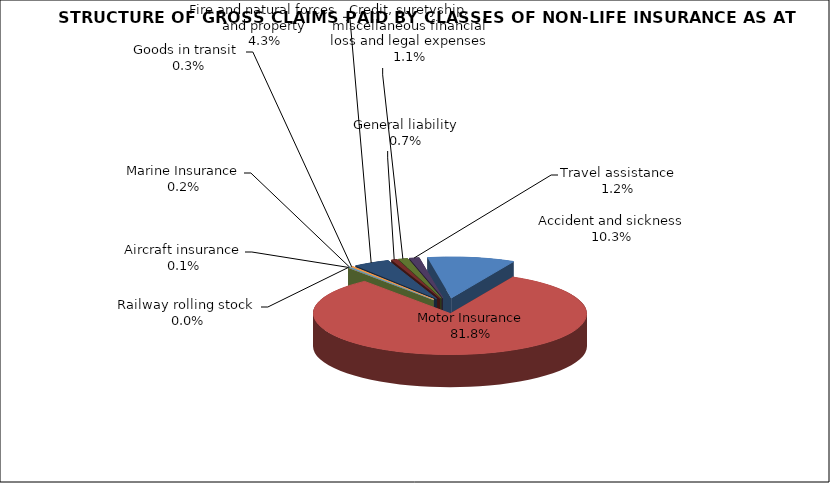
| Category | Accident and sickness |
|---|---|
| Accident and sickness | 0.103 |
| Motor Insurance | 0.818 |
| Railway rolling stock  | 0 |
| Aircraft insurance | 0.001 |
| Marine Insurance | 0.002 |
| Goods in transit  | 0.003 |
| Fire and natural forces and property | 0.043 |
| General liability | 0.007 |
| Credit, suretyship, miscellaneous financial loss and legal expenses | 0.011 |
| Travel assistance | 0.012 |